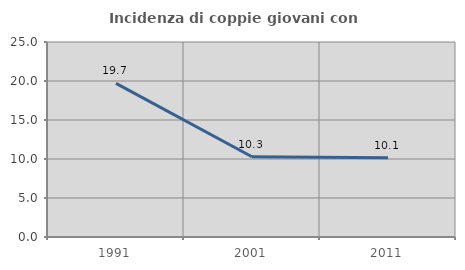
| Category | Incidenza di coppie giovani con figli |
|---|---|
| 1991.0 | 19.688 |
| 2001.0 | 10.294 |
| 2011.0 | 10.149 |